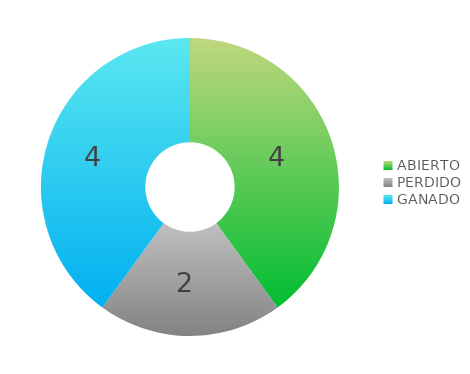
| Category | Series 0 |
|---|---|
| ABIERTO | 4 |
| PERDIDO | 2 |
| GANADO | 4 |